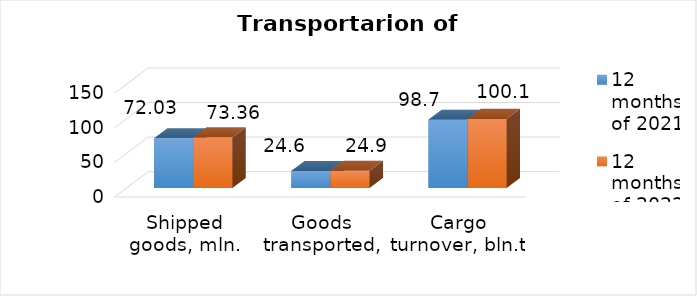
| Category | 12 months of 2021 | 12 months of 2022 |
|---|---|---|
| Shipped goods, mln. tons | 72.03 | 73.36 |
| Goods transported, million tons | 24.6 | 24.9 |
| Cargo turnover, bln.t.km | 98.7 | 100.1 |